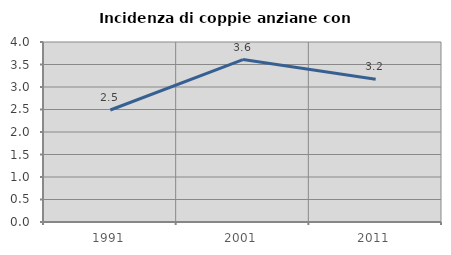
| Category | Incidenza di coppie anziane con figli |
|---|---|
| 1991.0 | 2.489 |
| 2001.0 | 3.61 |
| 2011.0 | 3.175 |